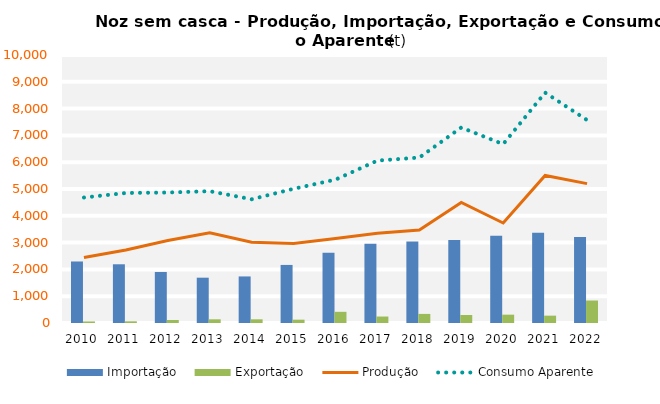
| Category | Importação | Exportação |
|---|---|---|
| 2010.0 | 2295.429 | 58.156 |
| 2011.0 | 2190.838 | 63.431 |
| 2012.0 | 1904.547 | 112.947 |
| 2013.0 | 1690.919 | 137.737 |
| 2014.0 | 1737.328 | 137.57 |
| 2015.0 | 2166.937 | 123.87 |
| 2016.0 | 2616.67 | 417.049 |
| 2017.0 | 2953.801 | 240.8 |
| 2018.0 | 3045.69 | 339.091 |
| 2019.0 | 3095.816 | 298.126 |
| 2020.0 | 3253.106 | 310.644 |
| 2021.0 | 3365.302 | 274.403 |
| 2022.0 | 3209.652 | 838.794 |